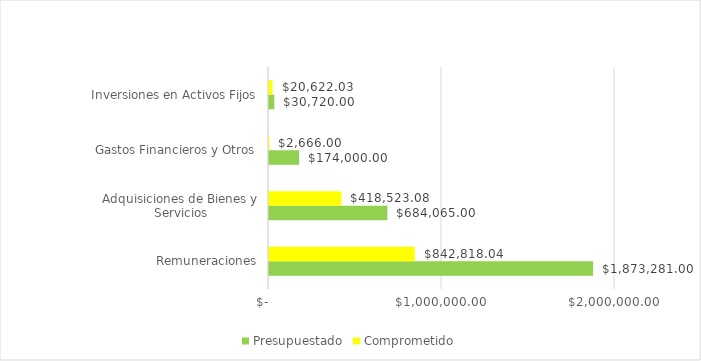
| Category | Presupuestado | Comprometido |
|---|---|---|
| Remuneraciones | 1873281 | 842818.04 |
| Adquisiciones de Bienes y Servicios | 684065 | 418523.08 |
| Gastos Financieros y Otros | 174000 | 2666 |
| Inversiones en Activos Fijos | 30720 | 20622.03 |